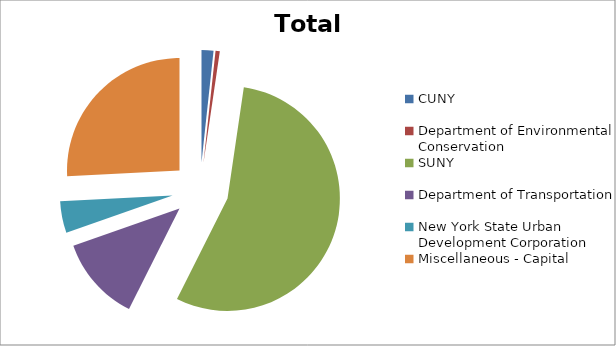
| Category | Series 0 |
|---|---|
| CUNY | 167500000 |
| Department of Environmental Conservation | 60000000 |
| SUNY | 5400100000 |
| Department of Transportation | 1198625000 |
| New York State Urban Development Corporation | 444386000 |
| Miscellaneous - Capital | 2531675000 |